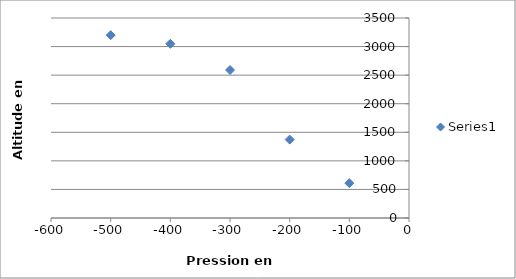
| Category | Series 0 |
|---|---|
| -500.0 | 3200 |
| -400.0 | 3048 |
| -300.0 | 2590 |
| -200.0 | 1372 |
| -100.0 | 610 |